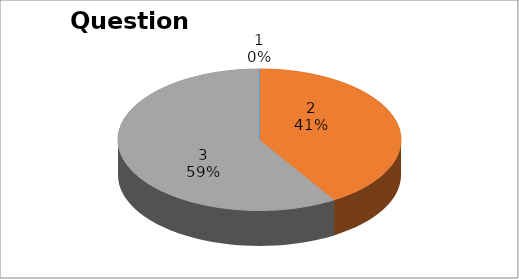
| Category | Series 0 |
|---|---|
| 0 | 0 |
| 1 | 7 |
| 2 | 10 |